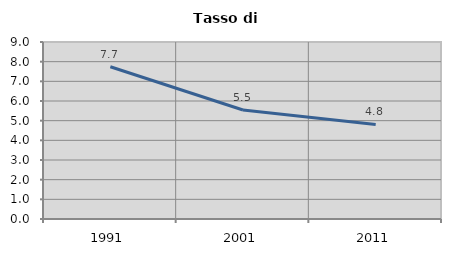
| Category | Tasso di disoccupazione   |
|---|---|
| 1991.0 | 7.741 |
| 2001.0 | 5.54 |
| 2011.0 | 4.809 |